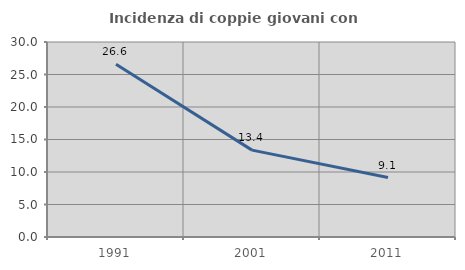
| Category | Incidenza di coppie giovani con figli |
|---|---|
| 1991.0 | 26.574 |
| 2001.0 | 13.367 |
| 2011.0 | 9.139 |